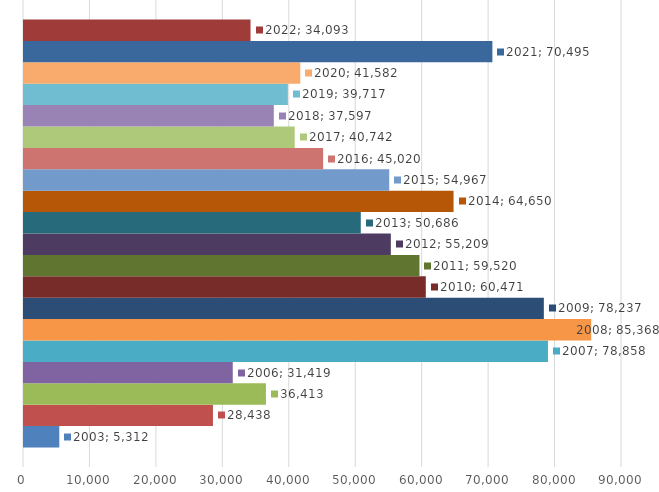
| Category | 2003 | 2004 | 2005 | 2006 | 2007 | 2008 | 2009 | 2010 | 2011 | 2012 | 2013 | 2014 | 2015 | 2016 | 2017 | 2018 | 2019 | 2020 | 2021 | 2022 |
|---|---|---|---|---|---|---|---|---|---|---|---|---|---|---|---|---|---|---|---|---|
| 0 | 5312 | 28438 | 36413 | 31419 | 78858 | 85368 | 78237 | 60471 | 59520 | 55209 | 50686 | 64650 | 54967 | 45020 | 40742 | 37597 | 39717 | 41582 | 70495 | 34093 |